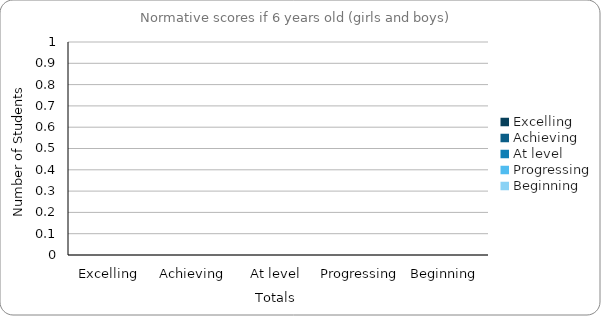
| Category | If 6 years old |
|---|---|
| Excelling | 0 |
| Achieving | 0 |
| At level | 0 |
| Progressing | 0 |
| Beginning | 0 |